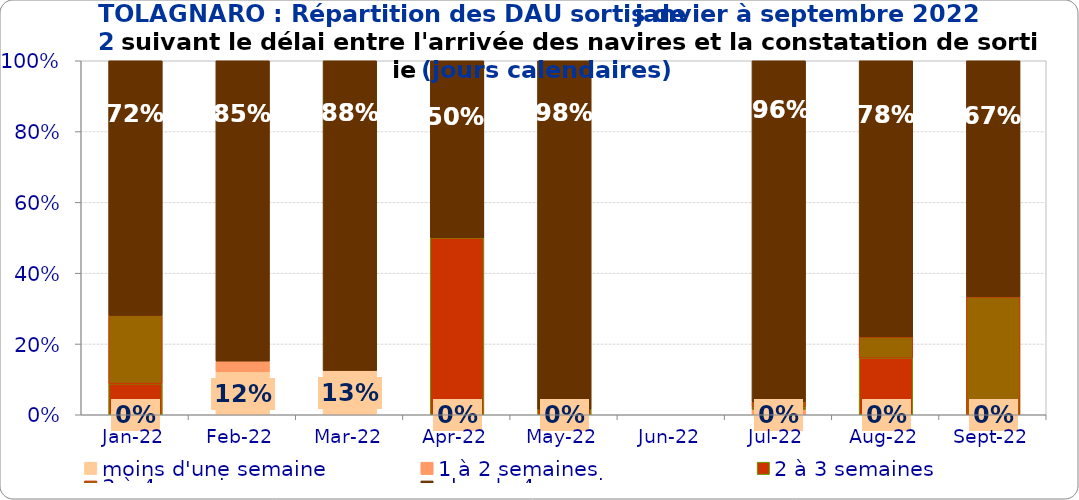
| Category | moins d'une semaine | 1 à 2 semaines | 2 à 3 semaines | 3 à 4 semaines | plus de 4 semaines |
|---|---|---|---|---|---|
| 2022-01-01 | 0 | 0 | 0.088 | 0.193 | 0.719 |
| 2022-02-01 | 0.121 | 0.03 | 0 | 0 | 0.848 |
| 2022-03-01 | 0.125 | 0 | 0 | 0 | 0.875 |
| 2022-04-01 | 0 | 0 | 0.5 | 0 | 0.5 |
| 2022-05-01 | 0 | 0 | 0.015 | 0 | 0.985 |
| 2022-06-01 | 0 | 0 | 0 | 0 | 0 |
| 2022-07-01 | 0 | 0.015 | 0.007 | 0.015 | 0.963 |
| 2022-08-01 | 0 | 0 | 0.16 | 0.06 | 0.78 |
| 2022-09-01 | 0 | 0 | 0 | 0.333 | 0.667 |